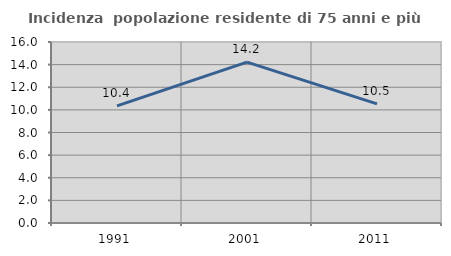
| Category | Incidenza  popolazione residente di 75 anni e più |
|---|---|
| 1991.0 | 10.357 |
| 2001.0 | 14.226 |
| 2011.0 | 10.526 |